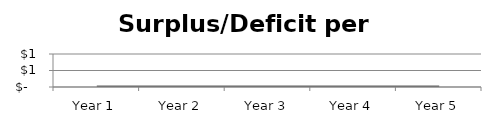
| Category | Surplus/Deficit per EFTS |
|---|---|
| Year 1 | 0 |
| Year 2 | 0 |
| Year 3 | 0 |
| Year 4 | 0 |
| Year 5 | 0 |